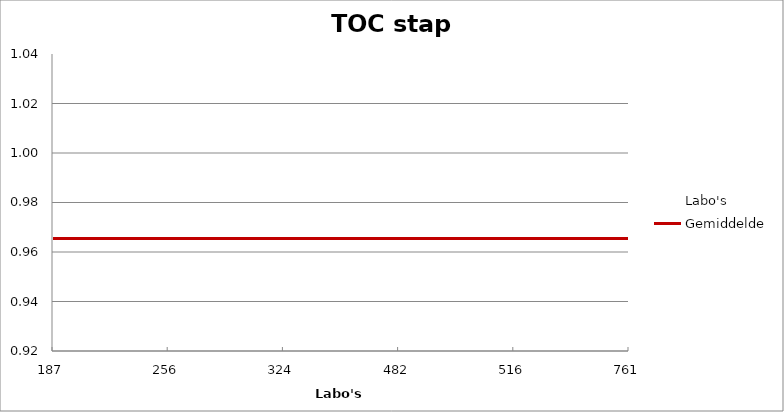
| Category | Labo's | Gemiddelde |
|---|---|---|
| 187.0 | 0.96 | 0.965 |
| 256.0 | 0.94 | 0.965 |
| 324.0 | 0.97 | 0.965 |
| 482.0 | 0.97 | 0.965 |
| 516.0 | 0.97 | 0.965 |
| 761.0 | 0.98 | 0.965 |